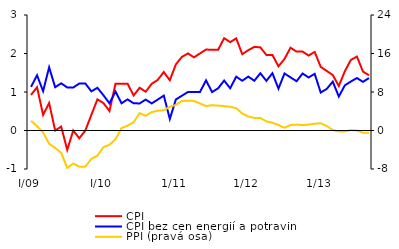
| Category | CPI | CPI bez cen energií a potravin |
|---|---|---|
| I/09 | 0.924 | 1.132 |
| 2 | 1.125 | 1.434 |
| 3 | 0.407 | 1.021 |
| 4 | 0.714 | 1.641 |
| 5 | 0 | 1.124 |
| 6 | 0.101 | 1.226 |
| 7 | -0.503 | 1.118 |
| 8 | 0 | 1.117 |
| 9 | -0.202 | 1.221 |
| 10 | 0 | 1.221 |
| 11 | 0.407 | 1.017 |
| 12 | 0.81 | 1.109 |
| I/10 | 0.712 | 0.916 |
| 2 | 0.506 | 0.707 |
| 3 | 1.216 | 1.011 |
| 4 | 1.215 | 0.706 |
| 5 | 1.216 | 0.808 |
| 6 | 0.909 | 0.706 |
| 7 | 1.111 | 0.704 |
| 8 | 1.008 | 0.803 |
| 9 | 1.213 | 0.704 |
| 10 | 1.314 | 0.804 |
| 11 | 1.518 | 0.906 |
| 12 | 1.305 | 0.299 |
| 1/11 | 1.717 | 0.806 |
| 2 | 1.911 | 0.903 |
| 3 | 2.002 | 1.001 |
| 4 | 1.9 | 1.002 |
| 5 | 2.002 | 1.002 |
| 6 | 2.102 | 1.303 |
| 7 | 2.098 | 0.998 |
| 8 | 2.096 | 1.096 |
| 9 | 2.398 | 1.297 |
| 10 | 2.295 | 1.097 |
| 11 | 2.393 | 1.397 |
| 12 | 1.982 | 1.292 |
| 1/12 | 2.085 | 1.4 |
| 2 | 2.172 | 1.292 |
| 3 | 2.159 | 1.487 |
| 4 | 1.963 | 1.29 |
| 5 | 1.963 | 1.488 |
| 6 | 1.667 | 1.088 |
| 7 | 1.859 | 1.482 |
| 8 | 2.151 | 1.379 |
| 9 | 2.049 | 1.281 |
| 10 | 2.049 | 1.479 |
| 11 | 1.947 | 1.378 |
| 12 | 2.041 | 1.472 |
| 1/13 | 1.654 | 0.986 |
| 2 | 1.546 | 1.079 |
| 3 | 1.441 | 1.27 |
| 4 | 1.155 | 0.881 |
| 5 | 1.54 | 1.173 |
| 6 | 1.832 | 1.272 |
| 7 | 1.921 | 1.363 |
| 8 | 1.531 | 1.263 |
| 9 | 1.434 | 1.362 |